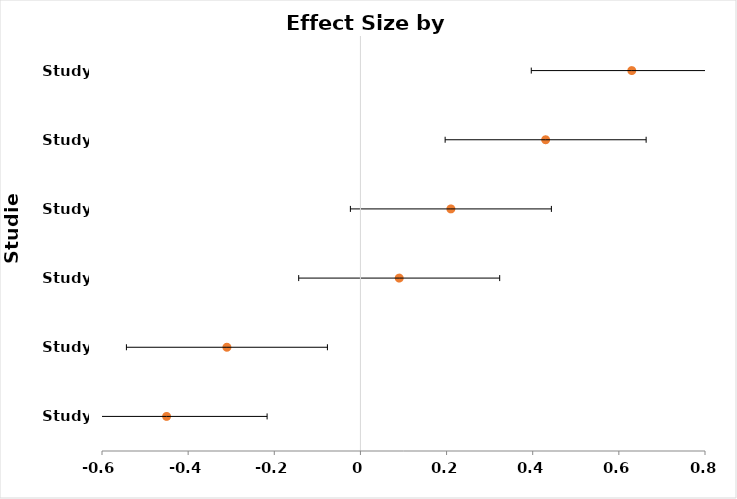
| Category | Effect Size |
|---|---|
| Study 1 | -0.45 |
| Study 2 | -0.31 |
| Study 3 | 0.09 |
| Study 4 | 0.21 |
| Study 5 | 0.43 |
| Study 6 | 0.63 |